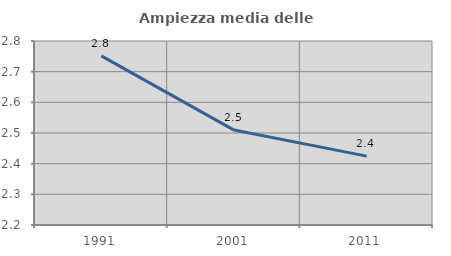
| Category | Ampiezza media delle famiglie |
|---|---|
| 1991.0 | 2.751 |
| 2001.0 | 2.51 |
| 2011.0 | 2.425 |